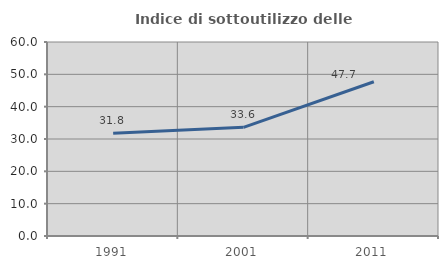
| Category | Indice di sottoutilizzo delle abitazioni  |
|---|---|
| 1991.0 | 31.78 |
| 2001.0 | 33.6 |
| 2011.0 | 47.703 |